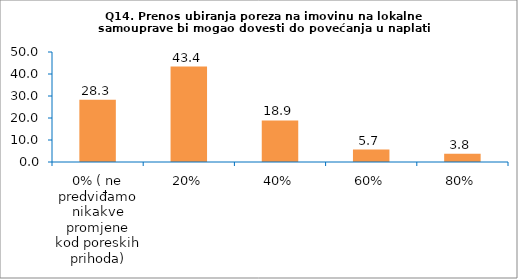
| Category | Series 0 |
|---|---|
| 0% ( ne predviđamo nikakve promjene kod poreskih prihoda) | 28.302 |
| 20% | 43.396 |
| 40% | 18.868 |
| 60% | 5.66 |
| 80% | 3.774 |